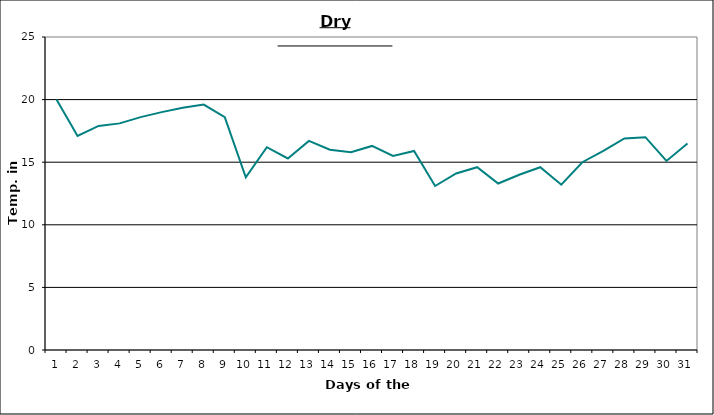
| Category | Series 0 |
|---|---|
| 0 | 20 |
| 1 | 17.1 |
| 2 | 17.9 |
| 3 | 18.1 |
| 4 | 18.6 |
| 5 | 19 |
| 6 | 19.35 |
| 7 | 19.6 |
| 8 | 18.6 |
| 9 | 13.8 |
| 10 | 16.2 |
| 11 | 15.3 |
| 12 | 16.7 |
| 13 | 16 |
| 14 | 15.8 |
| 15 | 16.3 |
| 16 | 15.5 |
| 17 | 15.9 |
| 18 | 13.1 |
| 19 | 14.1 |
| 20 | 14.6 |
| 21 | 13.3 |
| 22 | 14 |
| 23 | 14.6 |
| 24 | 13.2 |
| 25 | 15 |
| 26 | 15.9 |
| 27 | 16.9 |
| 28 | 17 |
| 29 | 15.1 |
| 30 | 16.5 |